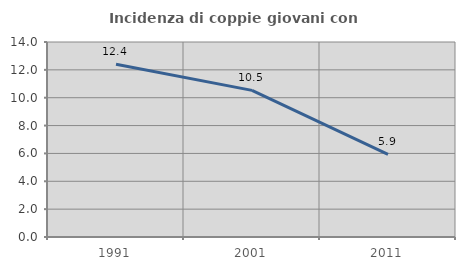
| Category | Incidenza di coppie giovani con figli |
|---|---|
| 1991.0 | 12.4 |
| 2001.0 | 10.526 |
| 2011.0 | 5.932 |